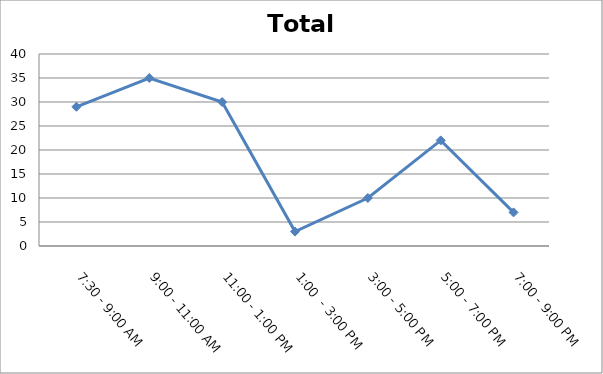
| Category | Total |
|---|---|
| 7:30 - 9:00 AM | 29 |
| 9:00 - 11:00 AM | 35 |
| 11:00 - 1:00 PM | 30 |
| 1:00  - 3:00 PM | 3 |
| 3:00 - 5:00 PM | 10 |
| 5:00 - 7:00 PM | 22 |
| 7:00 - 9:00 PM | 7 |